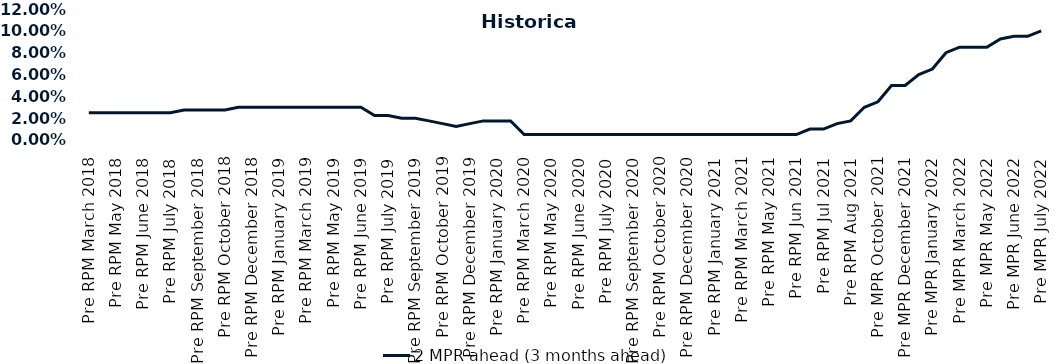
| Category | 2 MPR ahead (3 months ahead) |
|---|---|
| Pre RPM March 2018 | 0.025 |
| Post RPM March 2018 | 0.025 |
| Pre RPM May 2018 | 0.025 |
| Post RPM May 2018 | 0.025 |
| Pre RPM June 2018 | 0.025 |
| Post RPM June 2018 | 0.025 |
| Pre RPM July 2018 | 0.025 |
| Post RPM July 2018 | 0.028 |
| Pre RPM September 2018 | 0.028 |
| Post RPM September 2018 | 0.028 |
| Pre RPM October 2018 | 0.028 |
| Post RPM October 2018 | 0.03 |
| Pre RPM December 2018 | 0.03 |
| Post RPM December 2018 | 0.03 |
| Pre RPM January 2019 | 0.03 |
| Post RPM January 2019 | 0.03 |
| Pre RPM March 2019 | 0.03 |
| Post RPM March 2019 | 0.03 |
| Pre RPM May 2019 | 0.03 |
| Post RPM May 2019 | 0.03 |
| Pre RPM June 2019 | 0.03 |
| Post RPM June 2019 | 0.022 |
| Pre RPM July 2019 | 0.022 |
| Post RPM July 2019 | 0.02 |
| Pre RPM September 2019 | 0.02 |
| Post RPM September 2019 | 0.018 |
| Pre RPM October 2019 | 0.015 |
| Post RPM October 2019 | 0.012 |
| Pre RPM December 2019 | 0.015 |
| Post RPM December 2019 | 0.018 |
| Pre RPM January 2020 | 0.018 |
| Post RPM January 2020 | 0.018 |
| Pre RPM March 2020 | 0.005 |
| Post RPM March 2020 | 0.005 |
| Pre RPM May 2020 | 0.005 |
| Post RPM May 2020 | 0.005 |
| Pre RPM June 2020 | 0.005 |
| Post RPM June 2020 | 0.005 |
| Pre RPM July 2020 | 0.005 |
| Post RPM July 2020 | 0.005 |
| Pre RPM September 2020 | 0.005 |
| Post RPM September 2020 | 0.005 |
| Pre RPM October 2020 | 0.005 |
| Post RPM October 2020 | 0.005 |
| Pre RPM December 2020 | 0.005 |
|  Post RPM December 2020 | 0.005 |
| Pre RPM January 2021 | 0.005 |
| Post RPM January 2021 | 0.005 |
|  Pre RPM March 2021 | 0.005 |
|  Post RPM March 2021 | 0.005 |
|  Pre RPM May 2021 | 0.005 |
|  Post RPM May 2021 | 0.005 |
|  Pre RPM Jun 2021 | 0.005 |
|   Post RPM Jun 2021 | 0.01 |
| Pre RPM Jul 2021 | 0.01 |
|  Post RPM Jul 2021 | 0.015 |
| Pre RPM Aug 2021 | 0.018 |
|  Post RPM Aug 2021 | 0.03 |
| Pre MPR October 2021 | 0.035 |
| Post MPR October 2021 | 0.05 |
| Pre MPR December 2021 | 0.05 |
| Post MPR December 2021 | 0.06 |
| Pre MPR January 2022 | 0.065 |
| Post MPR January 2022 | 0.08 |
| Pre MPR March 2022 | 0.085 |
| Post MPR March 2022 | 0.085 |
| Pre MPR May 2022 | 0.085 |
| Post MPR May 2022 | 0.092 |
| Pre MPR June 2022 | 0.095 |
| Post MPR June 2022 | 0.095 |
| Pre MPR July 2022 | 0.1 |